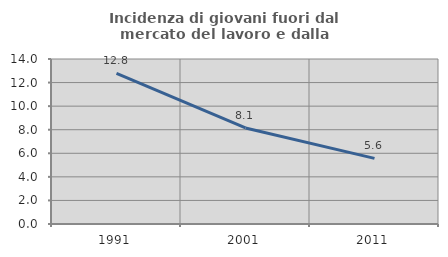
| Category | Incidenza di giovani fuori dal mercato del lavoro e dalla formazione  |
|---|---|
| 1991.0 | 12.771 |
| 2001.0 | 8.148 |
| 2011.0 | 5.571 |